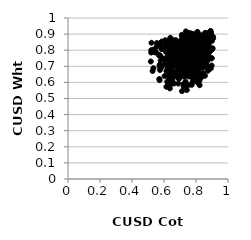
| Category | Series 0 |
|---|---|
| 0.8032709693896705 | 0.861 |
| 0.7423548564855764 | 0.7 |
| 0.6598434259487107 | 0.762 |
| 0.8691043415368068 | 0.841 |
| 0.8714225391466073 | 0.827 |
| 0.7827376489282902 | 0.646 |
| 0.6778970178173784 | 0.699 |
| 0.765579957225321 | 0.906 |
| 0.8115892868456154 | 0.631 |
| 0.796213893338463 | 0.749 |
| 0.7727589334761511 | 0.793 |
| 0.6329274914132588 | 0.862 |
| 0.8553405302881449 | 0.802 |
| 0.5689961544769234 | 0.768 |
| 0.7640300589531128 | 0.744 |
| 0.6557807507965396 | 0.768 |
| 0.6091190718727961 | 0.846 |
| 0.6632267273853174 | 0.755 |
| 0.8471008135141167 | 0.853 |
| 0.7099137604627728 | 0.798 |
| 0.5938261171411459 | 0.747 |
| 0.8681933570394909 | 0.823 |
| 0.64987128310343 | 0.787 |
| 0.5747970729806625 | 0.677 |
| 0.8402530996299308 | 0.874 |
| 0.5775720611950468 | 0.822 |
| 0.6837698497112241 | 0.787 |
| 0.6935339429260345 | 0.66 |
| 0.7906924804094604 | 0.652 |
| 0.7119114350522229 | 0.766 |
| 0.8137696616904289 | 0.802 |
| 0.7173182907097406 | 0.871 |
| 0.6727061191246002 | 0.669 |
| 0.8824640731678026 | 0.865 |
| 0.6939071413159161 | 0.76 |
| 0.6333331862572439 | 0.625 |
| 0.880119370819711 | 0.882 |
| 0.8771130128697302 | 0.676 |
| 0.6607062792613847 | 0.709 |
| 0.7282156086045215 | 0.823 |
| 0.8045231410309145 | 0.794 |
| 0.6472357720883822 | 0.757 |
| 0.8404713862704031 | 0.829 |
| 0.5397078846793173 | 0.788 |
| 0.7272654293517986 | 0.756 |
| 0.6522062979172762 | 0.713 |
| 0.8665192584665528 | 0.889 |
| 0.806164045816672 | 0.762 |
| 0.7362107198786281 | 0.859 |
| 0.7638232828013003 | 0.718 |
| 0.8195793910856913 | 0.863 |
| 0.6913165221718701 | 0.729 |
| 0.6327685582147213 | 0.776 |
| 0.6282035819923698 | 0.851 |
| 0.519693292914761 | 0.785 |
| 0.7469606546344709 | 0.726 |
| 0.7575331703740695 | 0.807 |
| 0.8288218761124342 | 0.771 |
| 0.8795981114739099 | 0.855 |
| 0.7050349001096436 | 0.816 |
| 0.8088200741405508 | 0.728 |
| 0.8286301080964353 | 0.845 |
| 0.6685274058431881 | 0.741 |
| 0.8227854008310271 | 0.583 |
| 0.7733393202095609 | 0.585 |
| 0.8072804352926395 | 0.834 |
| 0.861658471779306 | 0.883 |
| 0.8387816660067539 | 0.762 |
| 0.8759151413777412 | 0.742 |
| 0.7753280677120488 | 0.634 |
| 0.7538196244558724 | 0.867 |
| 0.7237128470297125 | 0.636 |
| 0.7755830877020009 | 0.812 |
| 0.8263482534901276 | 0.627 |
| 0.7725611516733412 | 0.73 |
| 0.6044058127038338 | 0.748 |
| 0.7388403730750214 | 0.739 |
| 0.7323420790990469 | 0.853 |
| 0.5721867065260565 | 0.7 |
| 0.5793302320056788 | 0.736 |
| 0.6459773080879805 | 0.669 |
| 0.8770519983634966 | 0.886 |
| 0.6194709167579291 | 0.797 |
| 0.6619589148823541 | 0.713 |
| 0.7542343827593938 | 0.845 |
| 0.7093017567323795 | 0.65 |
| 0.804156059186065 | 0.883 |
| 0.6474460923805192 | 0.691 |
| 0.6404696853076176 | 0.749 |
| 0.866151810777639 | 0.797 |
| 0.7257766805225991 | 0.653 |
| 0.7431477108776974 | 0.899 |
| 0.8363078032742416 | 0.764 |
| 0.8943332809760327 | 0.805 |
| 0.749058573822742 | 0.777 |
| 0.8089252955472758 | 0.914 |
| 0.7934841771219743 | 0.681 |
| 0.7695768371874804 | 0.775 |
| 0.7547589923511685 | 0.731 |
| 0.7421306874875271 | 0.74 |
| 0.75348026258225 | 0.637 |
| 0.7846083117250888 | 0.794 |
| 0.7125061593227802 | 0.546 |
| 0.7283871585288235 | 0.889 |
| 0.7994548251470469 | 0.857 |
| 0.6757330283038707 | 0.84 |
| 0.8801202028509731 | 0.819 |
| 0.6767604495825813 | 0.783 |
| 0.6838551736538475 | 0.767 |
| 0.6202162658376055 | 0.605 |
| 0.7583969121939733 | 0.884 |
| 0.7106939502998884 | 0.77 |
| 0.8534857246416968 | 0.791 |
| 0.8514262892064758 | 0.839 |
| 0.8166134649791368 | 0.9 |
| 0.7663943331490303 | 0.771 |
| 0.7312433982489948 | 0.579 |
| 0.8388205085107627 | 0.773 |
| 0.573473413349401 | 0.711 |
| 0.605248125059233 | 0.711 |
| 0.6364177093774204 | 0.795 |
| 0.8978253815106574 | 0.705 |
| 0.6845414932845755 | 0.799 |
| 0.7025712322271571 | 0.658 |
| 0.8638566810133051 | 0.797 |
| 0.7391472050033255 | 0.816 |
| 0.803992619431873 | 0.817 |
| 0.8860656333993523 | 0.865 |
| 0.6692000110771155 | 0.647 |
| 0.7137696789688032 | 0.647 |
| 0.7190120735686015 | 0.694 |
| 0.7806549943993195 | 0.823 |
| 0.6918135688422788 | 0.684 |
| 0.8664537927338196 | 0.726 |
| 0.6654469035957716 | 0.739 |
| 0.8402578489220114 | 0.743 |
| 0.7384934539696669 | 0.758 |
| 0.7512672709647772 | 0.821 |
| 0.7115889098477752 | 0.896 |
| 0.7203584612348345 | 0.846 |
| 0.7064198570597944 | 0.862 |
| 0.8105989640618897 | 0.857 |
| 0.7340453391882493 | 0.701 |
| 0.7295389295658214 | 0.727 |
| 0.6672661514933329 | 0.812 |
| 0.7688472253540917 | 0.713 |
| 0.8081610767742068 | 0.91 |
| 0.6622719589834678 | 0.861 |
| 0.6739571058094502 | 0.646 |
| 0.7318077837816779 | 0.582 |
| 0.7711310566042715 | 0.768 |
| 0.7276701120755408 | 0.579 |
| 0.7099986784619694 | 0.69 |
| 0.707141092402807 | 0.792 |
| 0.6536394769817286 | 0.638 |
| 0.8476036473724986 | 0.79 |
| 0.7289987892245122 | 0.821 |
| 0.7058838440510679 | 0.842 |
| 0.7436741864147498 | 0.866 |
| 0.8607209331284937 | 0.847 |
| 0.6154642180490486 | 0.671 |
| 0.8759411780651589 | 0.771 |
| 0.7055508929999025 | 0.695 |
| 0.8034355838342349 | 0.763 |
| 0.6479561899821824 | 0.862 |
| 0.742640021879776 | 0.553 |
| 0.779450347132422 | 0.605 |
| 0.8105051209622801 | 0.846 |
| 0.6301106878358884 | 0.643 |
| 0.8179566553021137 | 0.865 |
| 0.8313522321203889 | 0.746 |
| 0.8056391126235697 | 0.766 |
| 0.6332785449012553 | 0.847 |
| 0.5775161577887029 | 0.762 |
| 0.7795075506249245 | 0.711 |
| 0.7867610947239991 | 0.852 |
| 0.7098566358340308 | 0.771 |
| 0.8430538366364626 | 0.659 |
| 0.7536178042764098 | 0.888 |
| 0.7368473742050092 | 0.742 |
| 0.7305381670419013 | 0.639 |
| 0.82718887848626 | 0.843 |
| 0.6896869551601871 | 0.593 |
| 0.8752482424398266 | 0.889 |
| 0.8593856007419368 | 0.751 |
| 0.7265373918178524 | 0.826 |
| 0.7036787851549049 | 0.713 |
| 0.6565587777293431 | 0.816 |
| 0.8383410415097502 | 0.882 |
| 0.7972829842199722 | 0.761 |
| 0.5737951716121463 | 0.769 |
| 0.7542074944802746 | 0.584 |
| 0.7882678889008401 | 0.678 |
| 0.5173630703787712 | 0.73 |
| 0.774537172742852 | 0.743 |
| 0.8006778995175717 | 0.636 |
| 0.6928064798666982 | 0.622 |
| 0.8741063806953786 | 0.672 |
| 0.870817246412191 | 0.778 |
| 0.89450302686768 | 0.869 |
| 0.7392505908710123 | 0.697 |
| 0.6038164441284374 | 0.639 |
| 0.8362119118429244 | 0.864 |
| 0.7263367499885969 | 0.811 |
| 0.5314006532622519 | 0.802 |
| 0.6418031825860185 | 0.657 |
| 0.8075193728055542 | 0.741 |
| 0.7225342429461605 | 0.576 |
| 0.8553838301177639 | 0.887 |
| 0.781192668793234 | 0.651 |
| 0.6575897805093425 | 0.665 |
| 0.8119907067193153 | 0.677 |
| 0.7762066515214093 | 0.876 |
| 0.7256245793398888 | 0.821 |
| 0.7863880553086041 | 0.801 |
| 0.7909509361918339 | 0.864 |
| 0.6464478923391506 | 0.772 |
| 0.8272743025204821 | 0.755 |
| 0.6969344807598599 | 0.713 |
| 0.6166084746153143 | 0.85 |
| 0.6248821329984071 | 0.593 |
| 0.7736759634122263 | 0.858 |
| 0.6998454899499638 | 0.747 |
| 0.6979841043138573 | 0.839 |
| 0.8257973348162633 | 0.641 |
| 0.8949694678438953 | 0.873 |
| 0.6564048668223479 | 0.823 |
| 0.8135377942328204 | 0.597 |
| 0.8117417465970665 | 0.642 |
| 0.6571484864448363 | 0.828 |
| 0.8320771025849988 | 0.701 |
| 0.533887647944649 | 0.688 |
| 0.7907410657887838 | 0.616 |
| 0.8358017524959228 | 0.793 |
| 0.7794568502730198 | 0.627 |
| 0.7850541750455688 | 0.835 |
| 0.6418635814719591 | 0.654 |
| 0.5862020279319375 | 0.854 |
| 0.8391482701783927 | 0.883 |
| 0.8853080494634721 | 0.79 |
| 0.6724222661877335 | 0.816 |
| 0.763548444712587 | 0.873 |
| 0.7432097333449563 | 0.811 |
| 0.8051088386212268 | 0.605 |
| 0.6684249609323338 | 0.643 |
| 0.6256055548359836 | 0.769 |
| 0.780225585589942 | 0.715 |
| 0.6527471378187855 | 0.618 |
| 0.5522353841979484 | 0.819 |
| 0.7348350775101252 | 0.643 |
| 0.8674172011176938 | 0.792 |
| 0.6541757701839088 | 0.633 |
| 0.758494909651827 | 0.819 |
| 0.8043880667972751 | 0.664 |
| 0.8350919824585963 | 0.752 |
| 0.6941183682122629 | 0.681 |
| 0.7677942567391318 | 0.851 |
| 0.858767403330034 | 0.716 |
| 0.7899956717226198 | 0.881 |
| 0.7601010153337655 | 0.816 |
| 0.8229708177284629 | 0.788 |
| 0.9026632037954024 | 0.811 |
| 0.800653049115692 | 0.818 |
| 0.6743735953518992 | 0.862 |
| 0.7509926994845911 | 0.697 |
| 0.8041687026402066 | 0.719 |
| 0.7526626436029425 | 0.843 |
| 0.6590966436143617 | 0.843 |
| 0.7536124999165146 | 0.837 |
| 0.8482703252560583 | 0.85 |
| 0.7939350076979133 | 0.801 |
| 0.8065258767415783 | 0.738 |
| 0.7645281001276926 | 0.841 |
| 0.8298544823551988 | 0.691 |
| 0.900179090952779 | 0.858 |
| 0.7624680642739496 | 0.667 |
| 0.7569164949892593 | 0.84 |
| 0.8383278038372611 | 0.886 |
| 0.8927649718064053 | 0.688 |
| 0.8161274867208911 | 0.726 |
| 0.5898379512850087 | 0.746 |
| 0.7480391428663757 | 0.697 |
| 0.8422877342297211 | 0.737 |
| 0.8023822088120829 | 0.885 |
| 0.779887884954922 | 0.784 |
| 0.7246171414025189 | 0.648 |
| 0.6929604707624023 | 0.812 |
| 0.8090423591071062 | 0.868 |
| 0.6901081000426497 | 0.812 |
| 0.764297434544697 | 0.755 |
| 0.6389143337643344 | 0.634 |
| 0.5707921079398497 | 0.841 |
| 0.8734069489953272 | 0.83 |
| 0.7349379624645013 | 0.71 |
| 0.6466728139655606 | 0.78 |
| 0.811206891568404 | 0.77 |
| 0.7925205659479373 | 0.731 |
| 0.520673768344847 | 0.8 |
| 0.8945789761978964 | 0.907 |
| 0.6929046008509305 | 0.626 |
| 0.8070105750034693 | 0.816 |
| 0.8479890022797165 | 0.825 |
| 0.6469837983717996 | 0.862 |
| 0.8120115932521315 | 0.696 |
| 0.5708767215018441 | 0.621 |
| 0.7583929079497014 | 0.72 |
| 0.8571403182245638 | 0.786 |
| 0.8730019235811741 | 0.764 |
| 0.8566818354562867 | 0.781 |
| 0.8747554353596836 | 0.746 |
| 0.7123460083003081 | 0.736 |
| 0.6821340634445299 | 0.769 |
| 0.8062270229683994 | 0.842 |
| 0.7640222525272916 | 0.73 |
| 0.5218087248418877 | 0.846 |
| 0.5553833788162691 | 0.844 |
| 0.7020000690593868 | 0.856 |
| 0.7819106693216886 | 0.676 |
| 0.8470623523992796 | 0.879 |
| 0.7477594051710688 | 0.67 |
| 0.6045092104476655 | 0.737 |
| 0.7938500899156526 | 0.734 |
| 0.8019696741274474 | 0.691 |
| 0.5881167215792954 | 0.807 |
| 0.5847119534395125 | 0.808 |
| 0.8234609345021229 | 0.71 |
| 0.6147055295968982 | 0.573 |
| 0.8305534976725266 | 0.704 |
| 0.7600284535162085 | 0.782 |
| 0.7966381738687425 | 0.836 |
| 0.842016805765151 | 0.884 |
| 0.8963604844928772 | 0.748 |
| 0.7132939887153296 | 0.762 |
| 0.6136442408252278 | 0.823 |
| 0.6620749496418743 | 0.593 |
| 0.7303567890378486 | 0.76 |
| 0.8331524510055195 | 0.631 |
| 0.8782024948499749 | 0.785 |
| 0.8631691311011693 | 0.905 |
| 0.7021958533654091 | 0.642 |
| 0.8212627881632265 | 0.61 |
| 0.6905481701690392 | 0.751 |
| 0.5843848699094814 | 0.693 |
| 0.7984555521060686 | 0.738 |
| 0.7479962037426425 | 0.743 |
| 0.7895717574319614 | 0.72 |
| 0.8148357291184969 | 0.807 |
| 0.7596059266898231 | 0.643 |
| 0.878535743118565 | 0.698 |
| 0.7109751965561077 | 0.745 |
| 0.6131331666363796 | 0.788 |
| 0.711149110588448 | 0.736 |
| 0.7705928870002344 | 0.836 |
| 0.7075783105933062 | 0.648 |
| 0.7381533567015426 | 0.887 |
| 0.7193241067431531 | 0.802 |
| 0.6789615810448852 | 0.665 |
| 0.8488598629719599 | 0.696 |
| 0.6815795668717068 | 0.793 |
| 0.6443146969466802 | 0.79 |
| 0.7357550141190204 | 0.882 |
| 0.898684437132976 | 0.803 |
| 0.8156607896738238 | 0.658 |
| 0.5820125032003665 | 0.705 |
| 0.7789898338406039 | 0.748 |
| 0.8469566487373478 | 0.716 |
| 0.6320408128118286 | 0.595 |
| 0.7983889805592735 | 0.686 |
| 0.7808475260207768 | 0.714 |
| 0.7193998446460548 | 0.796 |
| 0.8329611126447011 | 0.844 |
| 0.9072055657991427 | 0.874 |
| 0.715821832068351 | 0.745 |
| 0.6807829316332223 | 0.71 |
| 0.7509141591388235 | 0.907 |
| 0.6073563672836835 | 0.837 |
| 0.7846266337321905 | 0.753 |
| 0.8985180164195321 | 0.751 |
| 0.788418188167696 | 0.719 |
| 0.7440517346513875 | 0.654 |
| 0.8745595736459906 | 0.873 |
| 0.7451315868311541 | 0.843 |
| 0.6333457851035424 | 0.833 |
| 0.7803465576700006 | 0.675 |
| 0.7266407566161125 | 0.848 |
| 0.8119710548975738 | 0.844 |
| 0.7781462191721147 | 0.901 |
| 0.7144540109199713 | 0.859 |
| 0.8627596986416805 | 0.851 |
| 0.891432073102078 | 0.919 |
| 0.7927588135876735 | 0.847 |
| 0.6671969799135951 | 0.846 |
| 0.6394920716680534 | 0.877 |
| 0.8795487075834098 | 0.838 |
| 0.7776661228548115 | 0.741 |
| 0.725141692567888 | 0.793 |
| 0.7850248939169768 | 0.821 |
| 0.6707863681837736 | 0.64 |
| 0.7042071909252797 | 0.783 |
| 0.7279414735946057 | 0.76 |
| 0.7807093109535631 | 0.852 |
| 0.8601098892734728 | 0.864 |
| 0.696602647457853 | 0.733 |
| 0.9028665268710335 | 0.811 |
| 0.7496861528930099 | 0.778 |
| 0.7124454491547627 | 0.887 |
| 0.7595169073905482 | 0.719 |
| 0.8101728938061662 | 0.777 |
| 0.7412976160061954 | 0.797 |
| 0.829073044866307 | 0.714 |
| 0.6627789700321143 | 0.765 |
| 0.8458955110160212 | 0.705 |
| 0.720998233209811 | 0.588 |
| 0.6973431610624727 | 0.795 |
| 0.7397530542890304 | 0.832 |
| 0.8082859846240666 | 0.807 |
| 0.6767712996713905 | 0.815 |
| 0.7366681329798902 | 0.917 |
| 0.8559858980377876 | 0.845 |
| 0.8422573661944027 | 0.727 |
| 0.8077389096691403 | 0.79 |
| 0.5287263242974136 | 0.671 |
| 0.8137883859945584 | 0.726 |
| 0.7243834140951371 | 0.789 |
| 0.7540998388795984 | 0.743 |
| 0.6419665067834401 | 0.587 |
| 0.6985687262895119 | 0.772 |
| 0.7300869025102039 | 0.662 |
| 0.85641895634088 | 0.873 |
| 0.8276561609494468 | 0.703 |
| 0.7986534627709758 | 0.861 |
| 0.6481959762830867 | 0.643 |
| 0.8183119058352626 | 0.742 |
| 0.6784050946348729 | 0.753 |
| 0.7713439262402546 | 0.844 |
| 0.6695382431777221 | 0.837 |
| 0.8423934151885003 | 0.693 |
| 0.6715606938360887 | 0.806 |
| 0.6832738430206557 | 0.67 |
| 0.7129834048692383 | 0.721 |
| 0.8385460785546646 | 0.891 |
| 0.8560104837313892 | 0.641 |
| 0.7945542566751029 | 0.814 |
| 0.8002679495648325 | 0.719 |
| 0.5724569885126723 | 0.614 |
| 0.77857943197154 | 0.739 |
| 0.8594375863678958 | 0.844 |
| 0.700066575963861 | 0.697 |
| 0.6954331284319875 | 0.718 |
| 0.624938892966353 | 0.707 |
| 0.7037854695383339 | 0.672 |
| 0.7653998547683083 | 0.772 |
| 0.6369128220791889 | 0.563 |
| 0.728683049739114 | 0.666 |
| 0.856505010820873 | 0.908 |
| 0.767332494151442 | 0.639 |
| 0.8154713937343239 | 0.813 |
| 0.7877830027053849 | 0.769 |
| 0.7771230823952247 | 0.699 |
| 0.8148705461186638 | 0.751 |
| 0.8599566270558348 | 0.847 |
| 0.6498553462943686 | 0.836 |
| 0.6168458684349563 | 0.813 |
| 0.6800800374894294 | 0.78 |
| 0.6070810010633103 | 0.862 |
| 0.7557997440843225 | 0.835 |
| 0.8885856552387491 | 0.916 |
| 0.7879666107145615 | 0.781 |
| 0.8107909594203093 | 0.833 |
| 0.6261305264700658 | 0.749 |
| 0.6335042168653562 | 0.732 |
| 0.7256665867089934 | 0.845 |
| 0.7906054455394613 | 0.867 |
| 0.9068686126098089 | 0.883 |
| 0.8068255628960719 | 0.698 |
| 0.806503593529063 | 0.871 |
| 0.6230557752472559 | 0.685 |
| 0.8146920373261196 | 0.839 |
| 0.7206968532603979 | 0.685 |
| 0.8325814338272863 | 0.809 |
| 0.692030561112282 | 0.742 |
| 0.701480780598622 | 0.798 |
| 0.8028665803945804 | 0.715 |
| 0.631035336219397 | 0.816 |
| 0.8277680012301826 | 0.845 |
| 0.8310039539280849 | 0.712 |
| 0.7896743056816145 | 0.895 |
| 0.7473300796512681 | 0.894 |
| 0.6933827467354097 | 0.764 |
| 0.7837306140328136 | 0.633 |
| 0.847223264280552 | 0.699 |
| 0.7531239869040832 | 0.677 |
| 0.8309323706556896 | 0.891 |
| 0.6058872633278418 | 0.807 |
| 0.7342831276152866 | 0.605 |
| 0.8796645780810213 | 0.678 |
| 0.6864470102702624 | 0.814 |
| 0.8876210591051094 | 0.685 |
| 0.889225017852929 | 0.903 |
| 0.5526495629607097 | 0.785 |